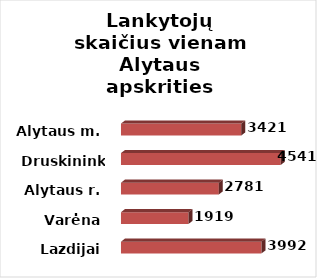
| Category | Series 0 |
|---|---|
| Lazdijai | 3992 |
| Varėna | 1919 |
| Alytaus r. | 2781 |
| Druskininkai | 4541 |
| Alytaus m. | 3421 |